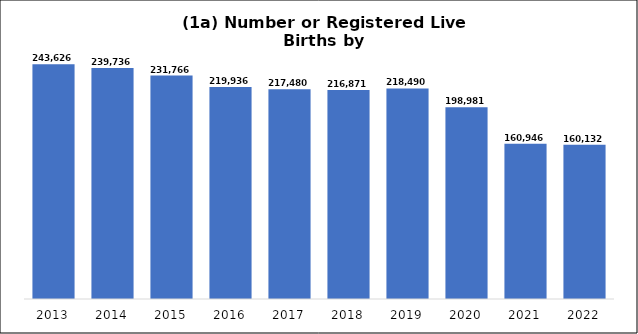
| Category | Series 0 |
|---|---|
| 2013.0 | 243626 |
| 2014.0 | 239736 |
| 2015.0 | 231766 |
| 2016.0 | 219936 |
| 2017.0 | 217480 |
| 2018.0 | 216871 |
| 2019.0 | 218490 |
| 2020.0 | 198981 |
| 2021.0 | 160946 |
| 2022.0 | 160132 |